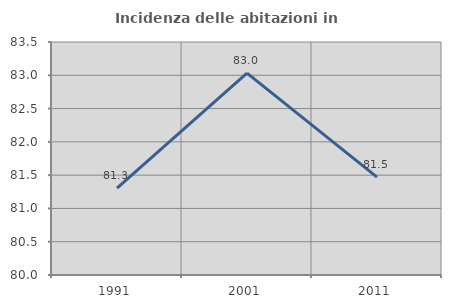
| Category | Incidenza delle abitazioni in proprietà  |
|---|---|
| 1991.0 | 81.304 |
| 2001.0 | 83.032 |
| 2011.0 | 81.47 |